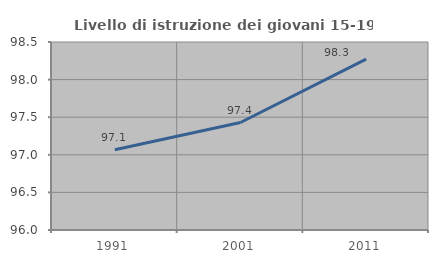
| Category | Livello di istruzione dei giovani 15-19 anni |
|---|---|
| 1991.0 | 97.068 |
| 2001.0 | 97.429 |
| 2011.0 | 98.273 |